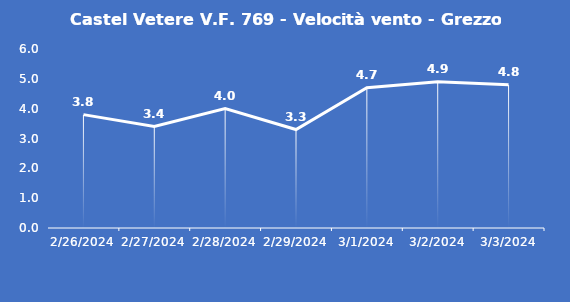
| Category | Castel Vetere V.F. 769 - Velocità vento - Grezzo (m/s) |
|---|---|
| 2/26/24 | 3.8 |
| 2/27/24 | 3.4 |
| 2/28/24 | 4 |
| 2/29/24 | 3.3 |
| 3/1/24 | 4.7 |
| 3/2/24 | 4.9 |
| 3/3/24 | 4.8 |